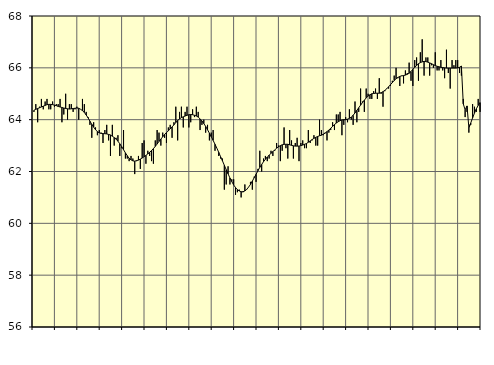
| Category | Piggar | Series 1 |
|---|---|---|
| nan | 64.3 | 64.36 |
| 1.0 | 64.6 | 64.4 |
| 1.0 | 63.9 | 64.43 |
| 1.0 | 64.5 | 64.46 |
| 1.0 | 64.8 | 64.49 |
| 1.0 | 64.4 | 64.52 |
| 1.0 | 64.7 | 64.55 |
| 1.0 | 64.8 | 64.58 |
| 1.0 | 64.4 | 64.59 |
| 1.0 | 64.4 | 64.59 |
| 1.0 | 64.7 | 64.58 |
| 1.0 | 64.5 | 64.56 |
| nan | 64.6 | 64.54 |
| 2.0 | 64.6 | 64.51 |
| 2.0 | 64.8 | 64.49 |
| 2.0 | 63.9 | 64.47 |
| 2.0 | 64.2 | 64.45 |
| 2.0 | 65 | 64.43 |
| 2.0 | 64 | 64.42 |
| 2.0 | 64.6 | 64.41 |
| 2.0 | 64.6 | 64.42 |
| 2.0 | 64.3 | 64.43 |
| 2.0 | 64.4 | 64.44 |
| 2.0 | 64.5 | 64.45 |
| nan | 64 | 64.44 |
| 3.0 | 64.4 | 64.4 |
| 3.0 | 64.8 | 64.35 |
| 3.0 | 64.6 | 64.28 |
| 3.0 | 64.3 | 64.18 |
| 3.0 | 64.1 | 64.07 |
| 3.0 | 63.8 | 63.94 |
| 3.0 | 63.3 | 63.82 |
| 3.0 | 63.9 | 63.71 |
| 3.0 | 63.7 | 63.61 |
| 3.0 | 63.4 | 63.54 |
| 3.0 | 63.6 | 63.49 |
| nan | 63.5 | 63.47 |
| 4.0 | 63.1 | 63.46 |
| 4.0 | 63.6 | 63.46 |
| 4.0 | 63.8 | 63.45 |
| 4.0 | 63.2 | 63.43 |
| 4.0 | 62.6 | 63.41 |
| 4.0 | 63.8 | 63.36 |
| 4.0 | 63 | 63.31 |
| 4.0 | 63.3 | 63.25 |
| 4.0 | 63.4 | 63.17 |
| 4.0 | 62.6 | 63.07 |
| 4.0 | 62.9 | 62.96 |
| nan | 63.6 | 62.84 |
| 5.0 | 62.5 | 62.72 |
| 5.0 | 62.5 | 62.61 |
| 5.0 | 62.4 | 62.51 |
| 5.0 | 62.6 | 62.45 |
| 5.0 | 62.5 | 62.41 |
| 5.0 | 61.9 | 62.4 |
| 5.0 | 62.4 | 62.42 |
| 5.0 | 62.6 | 62.44 |
| 5.0 | 62.1 | 62.48 |
| 5.0 | 63.1 | 62.52 |
| 5.0 | 63.2 | 62.57 |
| nan | 62.3 | 62.62 |
| 6.0 | 62.8 | 62.68 |
| 6.0 | 62.6 | 62.74 |
| 6.0 | 62.4 | 62.81 |
| 6.0 | 62.3 | 62.88 |
| 6.0 | 63.2 | 62.97 |
| 6.0 | 63.6 | 63.06 |
| 6.0 | 63.5 | 63.16 |
| 6.0 | 63 | 63.25 |
| 6.0 | 63.5 | 63.34 |
| 6.0 | 63.3 | 63.43 |
| 6.0 | 63.1 | 63.5 |
| nan | 63.7 | 63.57 |
| 7.0 | 63.8 | 63.64 |
| 7.0 | 63.3 | 63.72 |
| 7.0 | 63.9 | 63.8 |
| 7.0 | 64.5 | 63.89 |
| 7.0 | 63.2 | 63.97 |
| 7.0 | 64.3 | 64.03 |
| 7.0 | 64.5 | 64.08 |
| 7.0 | 63.7 | 64.11 |
| 7.0 | 64.3 | 64.14 |
| 7.0 | 64.5 | 64.17 |
| 7.0 | 63.7 | 64.19 |
| nan | 63.9 | 64.2 |
| 8.0 | 64.4 | 64.19 |
| 8.0 | 64.1 | 64.17 |
| 8.0 | 64.5 | 64.14 |
| 8.0 | 64.3 | 64.1 |
| 8.0 | 63.6 | 64.03 |
| 8.0 | 63.8 | 63.95 |
| 8.0 | 64 | 63.85 |
| 8.0 | 63.5 | 63.74 |
| 8.0 | 63.8 | 63.61 |
| 8.0 | 63.2 | 63.48 |
| 8.0 | 63.5 | 63.34 |
| nan | 63.6 | 63.2 |
| 9.0 | 62.8 | 63.05 |
| 9.0 | 62.9 | 62.9 |
| 9.0 | 62.6 | 62.74 |
| 9.0 | 62.5 | 62.57 |
| 9.0 | 62.5 | 62.41 |
| 9.0 | 61.3 | 62.24 |
| 9.0 | 61.5 | 62.07 |
| 9.0 | 62.2 | 61.91 |
| 9.0 | 61.5 | 61.75 |
| 9.0 | 61.7 | 61.61 |
| 9.0 | 61.7 | 61.48 |
| nan | 61.1 | 61.38 |
| 10.0 | 61.2 | 61.3 |
| 10.0 | 61.3 | 61.25 |
| 10.0 | 61 | 61.22 |
| 10.0 | 61.2 | 61.22 |
| 10.0 | 61.5 | 61.25 |
| 10.0 | 61.3 | 61.31 |
| 10.0 | 61.4 | 61.4 |
| 10.0 | 61.6 | 61.5 |
| 10.0 | 61.3 | 61.63 |
| 10.0 | 61.8 | 61.76 |
| 10.0 | 61.6 | 61.89 |
| nan | 62.1 | 62.03 |
| 11.0 | 62.8 | 62.16 |
| 11.0 | 62 | 62.27 |
| 11.0 | 62.5 | 62.38 |
| 11.0 | 62.6 | 62.47 |
| 11.0 | 62.4 | 62.56 |
| 11.0 | 62.5 | 62.63 |
| 11.0 | 62.8 | 62.7 |
| 11.0 | 62.6 | 62.77 |
| 11.0 | 62.8 | 62.83 |
| 11.0 | 63.1 | 62.9 |
| 11.0 | 63 | 62.95 |
| nan | 62.4 | 63 |
| 12.0 | 62.8 | 63.03 |
| 12.0 | 63.7 | 63.05 |
| 12.0 | 62.9 | 63.05 |
| 12.0 | 62.5 | 63.05 |
| 12.0 | 63.6 | 63.03 |
| 12.0 | 63.2 | 63.01 |
| 12.0 | 62.5 | 62.99 |
| 12.0 | 63.1 | 62.98 |
| 12.0 | 63.3 | 62.98 |
| 12.0 | 62.4 | 62.98 |
| 12.0 | 63.1 | 63 |
| nan | 63.2 | 63.02 |
| 13.0 | 62.9 | 63.05 |
| 13.0 | 62.9 | 63.08 |
| 13.0 | 63.6 | 63.13 |
| 13.0 | 63.1 | 63.18 |
| 13.0 | 63.2 | 63.23 |
| 13.0 | 63.4 | 63.28 |
| 13.0 | 63 | 63.32 |
| 13.0 | 63 | 63.35 |
| 13.0 | 64 | 63.38 |
| 13.0 | 63.6 | 63.4 |
| 13.0 | 63.4 | 63.44 |
| nan | 63.5 | 63.48 |
| 14.0 | 63.2 | 63.54 |
| 14.0 | 63.5 | 63.6 |
| 14.0 | 63.6 | 63.67 |
| 14.0 | 63.9 | 63.74 |
| 14.0 | 63.6 | 63.81 |
| 14.0 | 64.2 | 63.87 |
| 14.0 | 64.2 | 63.92 |
| 14.0 | 64.3 | 63.96 |
| 14.0 | 63.4 | 63.99 |
| 14.0 | 63.8 | 64 |
| 14.0 | 64.1 | 64 |
| nan | 63.9 | 64.02 |
| 15.0 | 64.4 | 64.05 |
| 15.0 | 64 | 64.1 |
| 15.0 | 63.8 | 64.17 |
| 15.0 | 64.7 | 64.26 |
| 15.0 | 63.9 | 64.36 |
| 15.0 | 64.3 | 64.46 |
| 15.0 | 65.2 | 64.56 |
| 15.0 | 64.7 | 64.66 |
| 15.0 | 64.3 | 64.75 |
| 15.0 | 65.2 | 64.84 |
| 15.0 | 65 | 64.91 |
| nan | 64.8 | 64.96 |
| 16.0 | 64.8 | 65 |
| 16.0 | 65.1 | 65.01 |
| 16.0 | 65.2 | 65.02 |
| 16.0 | 64.8 | 65.02 |
| 16.0 | 65.6 | 65.02 |
| 16.0 | 65 | 65.04 |
| 16.0 | 64.5 | 65.08 |
| 16.0 | 65.1 | 65.13 |
| 16.0 | 65.2 | 65.19 |
| 16.0 | 65.2 | 65.27 |
| 16.0 | 65.3 | 65.35 |
| nan | 65.5 | 65.43 |
| 17.0 | 65.7 | 65.51 |
| 17.0 | 66 | 65.58 |
| 17.0 | 65.6 | 65.63 |
| 17.0 | 65.3 | 65.67 |
| 17.0 | 65.7 | 65.69 |
| 17.0 | 65.4 | 65.7 |
| 17.0 | 65.9 | 65.72 |
| 17.0 | 65.8 | 65.75 |
| 17.0 | 66.2 | 65.79 |
| 17.0 | 65.5 | 65.86 |
| 17.0 | 65.3 | 65.94 |
| nan | 66.3 | 66.02 |
| 18.0 | 66.4 | 66.09 |
| 18.0 | 65.5 | 66.16 |
| 18.0 | 66.6 | 66.2 |
| 18.0 | 67.1 | 66.23 |
| 18.0 | 65.7 | 66.25 |
| 18.0 | 66.4 | 66.24 |
| 18.0 | 66.4 | 66.22 |
| 18.0 | 65.7 | 66.19 |
| 18.0 | 66.1 | 66.16 |
| 18.0 | 66 | 66.12 |
| 18.0 | 66.6 | 66.09 |
| nan | 65.9 | 66.06 |
| 19.0 | 65.9 | 66.04 |
| 19.0 | 66.3 | 66.02 |
| 19.0 | 65.9 | 66.01 |
| 19.0 | 65.6 | 66 |
| 19.0 | 66.7 | 65.99 |
| 19.0 | 65.8 | 65.99 |
| 19.0 | 65.2 | 65.99 |
| 19.0 | 66.3 | 65.99 |
| 19.0 | 66.1 | 65.99 |
| 19.0 | 66.3 | 65.99 |
| 19.0 | 66.3 | 66 |
| nan | 65.8 | 66.02 |
| 20.0 | 65.7 | 66.07 |
| 20.0 | 64.8 | 64.61 |
| 20.0 | 64.1 | 64.38 |
| 20.0 | 64.3 | 64.53 |
| 20.0 | 63.5 | 63.69 |
| 20.0 | 63.8 | 63.87 |
| 20.0 | 64.6 | 64.07 |
| 20.0 | 64.5 | 64.25 |
| 20.0 | 64.3 | 64.42 |
| 20.0 | 64.8 | 64.55 |
| 20.0 | 64.3 | 64.66 |